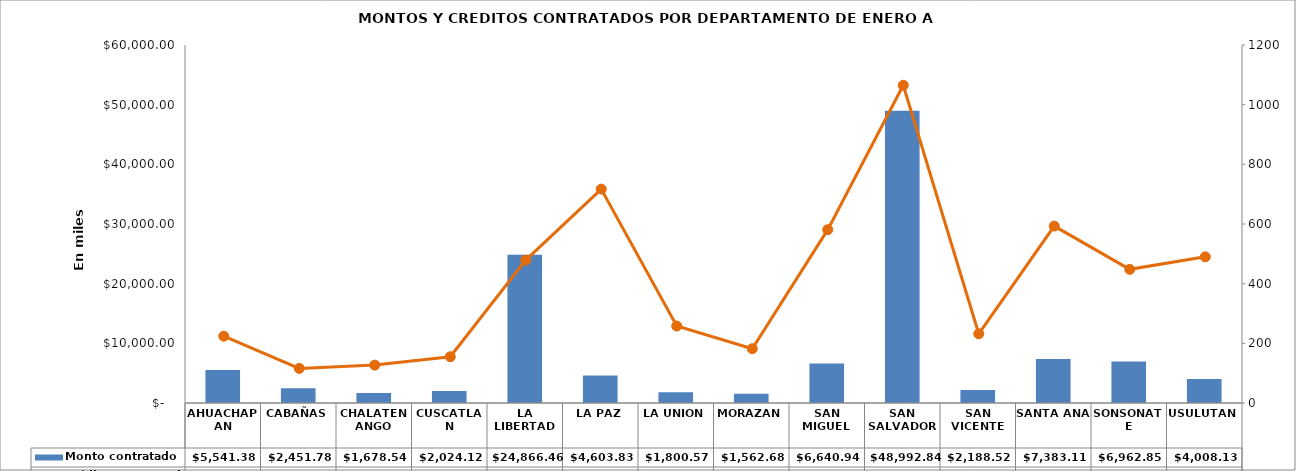
| Category | Monto contratado  |
|---|---|
| AHUACHAPAN | 5541.379 |
| CABAÑAS | 2451.782 |
| CHALATENANGO | 1678.543 |
| CUSCATLAN | 2024.118 |
| LA LIBERTAD | 24866.458 |
| LA PAZ | 4603.828 |
| LA UNION | 1800.574 |
| MORAZAN | 1562.683 |
| SAN MIGUEL | 6640.937 |
| SAN SALVADOR | 48992.84 |
| SAN VICENTE | 2188.52 |
| SANTA ANA | 7383.109 |
| SONSONATE | 6962.847 |
| USULUTAN | 4008.125 |